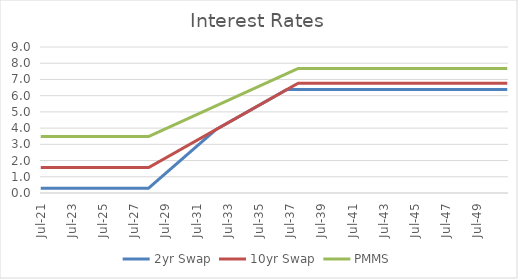
| Category | 2yr Swap | 10yr Swap | PMMS |
|---|---|---|---|
| 2021-07-31 | 0.296 | 1.565 | 3.48 |
| 2021-08-31 | 0.296 | 1.565 | 3.48 |
| 2021-09-30 | 0.296 | 1.565 | 3.48 |
| 2021-10-31 | 0.296 | 1.565 | 3.48 |
| 2021-11-30 | 0.296 | 1.565 | 3.48 |
| 2021-12-31 | 0.296 | 1.565 | 3.48 |
| 2022-01-31 | 0.296 | 1.565 | 3.48 |
| 2022-02-28 | 0.296 | 1.565 | 3.48 |
| 2022-03-31 | 0.296 | 1.565 | 3.48 |
| 2022-04-30 | 0.296 | 1.565 | 3.48 |
| 2022-05-31 | 0.296 | 1.565 | 3.48 |
| 2022-06-30 | 0.296 | 1.565 | 3.48 |
| 2022-07-31 | 0.296 | 1.565 | 3.48 |
| 2022-08-31 | 0.296 | 1.565 | 3.48 |
| 2022-09-30 | 0.296 | 1.565 | 3.48 |
| 2022-10-31 | 0.296 | 1.565 | 3.48 |
| 2022-11-30 | 0.296 | 1.565 | 3.48 |
| 2022-12-31 | 0.296 | 1.565 | 3.48 |
| 2023-01-31 | 0.296 | 1.565 | 3.48 |
| 2023-02-28 | 0.296 | 1.565 | 3.48 |
| 2023-03-31 | 0.296 | 1.565 | 3.48 |
| 2023-04-30 | 0.296 | 1.565 | 3.48 |
| 2023-05-31 | 0.296 | 1.565 | 3.48 |
| 2023-06-30 | 0.296 | 1.565 | 3.48 |
| 2023-07-31 | 0.296 | 1.565 | 3.48 |
| 2023-08-31 | 0.296 | 1.565 | 3.48 |
| 2023-09-30 | 0.296 | 1.565 | 3.48 |
| 2023-10-31 | 0.296 | 1.565 | 3.48 |
| 2023-11-30 | 0.296 | 1.565 | 3.48 |
| 2023-12-31 | 0.296 | 1.565 | 3.48 |
| 2024-01-31 | 0.296 | 1.565 | 3.48 |
| 2024-02-29 | 0.296 | 1.565 | 3.48 |
| 2024-03-31 | 0.296 | 1.565 | 3.48 |
| 2024-04-30 | 0.296 | 1.565 | 3.48 |
| 2024-05-31 | 0.296 | 1.565 | 3.48 |
| 2024-06-30 | 0.296 | 1.565 | 3.48 |
| 2024-07-31 | 0.296 | 1.565 | 3.48 |
| 2024-08-31 | 0.296 | 1.565 | 3.48 |
| 2024-09-30 | 0.296 | 1.565 | 3.48 |
| 2024-10-31 | 0.296 | 1.565 | 3.48 |
| 2024-11-30 | 0.296 | 1.565 | 3.48 |
| 2024-12-31 | 0.296 | 1.565 | 3.48 |
| 2025-01-31 | 0.296 | 1.565 | 3.48 |
| 2025-02-28 | 0.296 | 1.565 | 3.48 |
| 2025-03-31 | 0.296 | 1.565 | 3.48 |
| 2025-04-30 | 0.296 | 1.565 | 3.48 |
| 2025-05-31 | 0.296 | 1.565 | 3.48 |
| 2025-06-30 | 0.296 | 1.565 | 3.48 |
| 2025-07-31 | 0.296 | 1.565 | 3.48 |
| 2025-08-31 | 0.296 | 1.565 | 3.48 |
| 2025-09-30 | 0.296 | 1.565 | 3.48 |
| 2025-10-31 | 0.296 | 1.565 | 3.48 |
| 2025-11-30 | 0.296 | 1.565 | 3.48 |
| 2025-12-31 | 0.296 | 1.565 | 3.48 |
| 2026-01-31 | 0.296 | 1.565 | 3.48 |
| 2026-02-28 | 0.296 | 1.565 | 3.48 |
| 2026-03-31 | 0.296 | 1.565 | 3.48 |
| 2026-04-30 | 0.296 | 1.565 | 3.48 |
| 2026-05-31 | 0.296 | 1.565 | 3.48 |
| 2026-06-30 | 0.296 | 1.565 | 3.48 |
| 2026-07-31 | 0.296 | 1.565 | 3.48 |
| 2026-08-31 | 0.296 | 1.565 | 3.48 |
| 2026-09-30 | 0.296 | 1.565 | 3.48 |
| 2026-10-31 | 0.296 | 1.565 | 3.48 |
| 2026-11-30 | 0.296 | 1.565 | 3.48 |
| 2026-12-31 | 0.296 | 1.565 | 3.48 |
| 2027-01-31 | 0.296 | 1.565 | 3.48 |
| 2027-02-28 | 0.296 | 1.565 | 3.48 |
| 2027-03-31 | 0.296 | 1.565 | 3.48 |
| 2027-04-30 | 0.296 | 1.565 | 3.48 |
| 2027-05-31 | 0.296 | 1.565 | 3.48 |
| 2027-06-30 | 0.296 | 1.565 | 3.48 |
| 2027-07-31 | 0.296 | 1.565 | 3.48 |
| 2027-08-31 | 0.296 | 1.565 | 3.48 |
| 2027-09-30 | 0.296 | 1.565 | 3.48 |
| 2027-10-31 | 0.296 | 1.565 | 3.48 |
| 2027-11-30 | 0.296 | 1.565 | 3.48 |
| 2027-12-31 | 0.296 | 1.565 | 3.48 |
| 2028-01-31 | 0.296 | 1.565 | 3.48 |
| 2028-02-29 | 0.296 | 1.565 | 3.48 |
| 2028-03-31 | 0.296 | 1.565 | 3.48 |
| 2028-04-30 | 0.296 | 1.565 | 3.48 |
| 2028-05-31 | 0.296 | 1.565 | 3.48 |
| 2028-06-30 | 0.296 | 1.565 | 3.48 |
| 2028-07-31 | 0.366 | 1.61 | 3.517 |
| 2028-08-31 | 0.436 | 1.656 | 3.553 |
| 2028-09-30 | 0.505 | 1.701 | 3.59 |
| 2028-10-31 | 0.575 | 1.746 | 3.626 |
| 2028-11-30 | 0.645 | 1.791 | 3.663 |
| 2028-12-31 | 0.714 | 1.836 | 3.699 |
| 2029-01-31 | 0.784 | 1.882 | 3.735 |
| 2029-02-28 | 0.854 | 1.927 | 3.772 |
| 2029-03-31 | 0.923 | 1.972 | 3.808 |
| 2029-04-30 | 0.993 | 2.017 | 3.845 |
| 2029-05-31 | 1.063 | 2.063 | 3.881 |
| 2029-06-30 | 1.132 | 2.108 | 3.918 |
| 2029-07-31 | 1.202 | 2.153 | 3.954 |
| 2029-08-31 | 1.272 | 2.198 | 3.991 |
| 2029-09-30 | 1.341 | 2.243 | 4.027 |
| 2029-10-31 | 1.411 | 2.289 | 4.064 |
| 2029-11-30 | 1.481 | 2.334 | 4.1 |
| 2029-12-31 | 1.55 | 2.379 | 4.137 |
| 2030-01-31 | 1.62 | 2.424 | 4.173 |
| 2030-02-28 | 1.69 | 2.47 | 4.21 |
| 2030-03-31 | 1.759 | 2.515 | 4.246 |
| 2030-04-30 | 1.829 | 2.56 | 4.283 |
| 2030-05-31 | 1.899 | 2.605 | 4.319 |
| 2030-06-30 | 1.968 | 2.65 | 4.356 |
| 2030-07-31 | 2.038 | 2.696 | 4.392 |
| 2030-08-31 | 2.108 | 2.741 | 4.429 |
| 2030-09-30 | 2.177 | 2.786 | 4.465 |
| 2030-10-31 | 2.247 | 2.831 | 4.502 |
| 2030-11-30 | 2.317 | 2.876 | 4.538 |
| 2030-12-31 | 2.386 | 2.922 | 4.575 |
| 2031-01-31 | 2.456 | 2.967 | 4.611 |
| 2031-02-28 | 2.526 | 3.012 | 4.647 |
| 2031-03-31 | 2.595 | 3.057 | 4.684 |
| 2031-04-30 | 2.665 | 3.103 | 4.72 |
| 2031-05-31 | 2.735 | 3.148 | 4.757 |
| 2031-06-30 | 2.804 | 3.193 | 4.793 |
| 2031-07-31 | 2.874 | 3.238 | 4.83 |
| 2031-08-31 | 2.944 | 3.283 | 4.866 |
| 2031-09-30 | 3.013 | 3.329 | 4.903 |
| 2031-10-31 | 3.083 | 3.374 | 4.939 |
| 2031-11-30 | 3.153 | 3.419 | 4.976 |
| 2031-12-31 | 3.222 | 3.464 | 5.012 |
| 2032-01-31 | 3.292 | 3.51 | 5.049 |
| 2032-02-29 | 3.362 | 3.555 | 5.085 |
| 2032-03-31 | 3.431 | 3.6 | 5.122 |
| 2032-04-30 | 3.501 | 3.645 | 5.158 |
| 2032-05-31 | 3.571 | 3.69 | 5.195 |
| 2032-06-30 | 3.64 | 3.736 | 5.231 |
| 2032-07-31 | 3.71 | 3.781 | 5.268 |
| 2032-08-31 | 3.78 | 3.826 | 5.304 |
| 2032-09-30 | 3.849 | 3.871 | 5.341 |
| 2032-10-31 | 3.917 | 3.917 | 5.377 |
| 2032-11-30 | 3.962 | 3.962 | 5.414 |
| 2032-12-31 | 4.007 | 4.007 | 5.45 |
| 2033-01-31 | 4.052 | 4.052 | 5.486 |
| 2033-02-28 | 4.097 | 4.097 | 5.523 |
| 2033-03-31 | 4.143 | 4.143 | 5.559 |
| 2033-04-30 | 4.188 | 4.188 | 5.596 |
| 2033-05-31 | 4.233 | 4.233 | 5.632 |
| 2033-06-30 | 4.278 | 4.278 | 5.669 |
| 2033-07-31 | 4.324 | 4.324 | 5.705 |
| 2033-08-31 | 4.369 | 4.369 | 5.742 |
| 2033-09-30 | 4.414 | 4.414 | 5.778 |
| 2033-10-31 | 4.459 | 4.459 | 5.815 |
| 2033-11-30 | 4.504 | 4.504 | 5.851 |
| 2033-12-31 | 4.55 | 4.55 | 5.888 |
| 2034-01-31 | 4.595 | 4.595 | 5.924 |
| 2034-02-28 | 4.64 | 4.64 | 5.96 |
| 2034-03-31 | 4.685 | 4.685 | 5.997 |
| 2034-04-30 | 4.731 | 4.731 | 6.033 |
| 2034-05-31 | 4.776 | 4.776 | 6.07 |
| 2034-06-30 | 4.821 | 4.821 | 6.106 |
| 2034-07-31 | 4.866 | 4.866 | 6.143 |
| 2034-08-31 | 4.911 | 4.911 | 6.179 |
| 2034-09-30 | 4.957 | 4.957 | 6.216 |
| 2034-10-31 | 5.002 | 5.002 | 6.252 |
| 2034-11-30 | 5.047 | 5.047 | 6.289 |
| 2034-12-31 | 5.092 | 5.092 | 6.325 |
| 2035-01-31 | 5.138 | 5.138 | 6.362 |
| 2035-02-28 | 5.183 | 5.183 | 6.398 |
| 2035-03-31 | 5.228 | 5.228 | 6.434 |
| 2035-04-30 | 5.273 | 5.273 | 6.471 |
| 2035-05-31 | 5.318 | 5.318 | 6.507 |
| 2035-06-30 | 5.364 | 5.364 | 6.544 |
| 2035-07-31 | 5.409 | 5.409 | 6.58 |
| 2035-08-31 | 5.454 | 5.454 | 6.617 |
| 2035-09-30 | 5.499 | 5.499 | 6.653 |
| 2035-10-31 | 5.545 | 5.545 | 6.69 |
| 2035-11-30 | 5.59 | 5.59 | 6.726 |
| 2035-12-31 | 5.635 | 5.635 | 6.763 |
| 2036-01-31 | 5.68 | 5.68 | 6.799 |
| 2036-02-29 | 5.725 | 5.725 | 6.836 |
| 2036-03-31 | 5.771 | 5.771 | 6.872 |
| 2036-04-30 | 5.816 | 5.816 | 6.908 |
| 2036-05-31 | 5.861 | 5.861 | 6.945 |
| 2036-06-30 | 5.906 | 5.906 | 6.981 |
| 2036-07-31 | 5.951 | 5.951 | 7.018 |
| 2036-08-31 | 5.997 | 5.997 | 7.054 |
| 2036-09-30 | 6.042 | 6.042 | 7.091 |
| 2036-10-31 | 6.087 | 6.087 | 7.127 |
| 2036-11-30 | 6.132 | 6.132 | 7.164 |
| 2036-12-31 | 6.178 | 6.178 | 7.2 |
| 2037-01-31 | 6.223 | 6.223 | 7.237 |
| 2037-02-28 | 6.268 | 6.268 | 7.273 |
| 2037-03-31 | 6.313 | 6.313 | 7.31 |
| 2037-04-30 | 6.358 | 6.358 | 7.346 |
| 2037-05-31 | 6.387 | 6.404 | 7.382 |
| 2037-06-30 | 6.387 | 6.449 | 7.419 |
| 2037-07-31 | 6.387 | 6.494 | 7.455 |
| 2037-08-31 | 6.387 | 6.539 | 7.492 |
| 2037-09-30 | 6.387 | 6.585 | 7.528 |
| 2037-10-31 | 6.387 | 6.63 | 7.565 |
| 2037-11-30 | 6.387 | 6.675 | 7.601 |
| 2037-12-31 | 6.387 | 6.72 | 7.637 |
| 2038-01-31 | 6.387 | 6.758 | 7.668 |
| 2038-02-28 | 6.387 | 6.758 | 7.668 |
| 2038-03-31 | 6.387 | 6.758 | 7.668 |
| 2038-04-30 | 6.387 | 6.758 | 7.668 |
| 2038-05-31 | 6.387 | 6.758 | 7.668 |
| 2038-06-30 | 6.387 | 6.758 | 7.668 |
| 2038-07-31 | 6.387 | 6.758 | 7.668 |
| 2038-08-31 | 6.387 | 6.758 | 7.668 |
| 2038-09-30 | 6.387 | 6.758 | 7.668 |
| 2038-10-31 | 6.387 | 6.758 | 7.668 |
| 2038-11-30 | 6.387 | 6.758 | 7.668 |
| 2038-12-31 | 6.387 | 6.758 | 7.668 |
| 2039-01-31 | 6.387 | 6.758 | 7.668 |
| 2039-02-28 | 6.387 | 6.758 | 7.668 |
| 2039-03-31 | 6.387 | 6.758 | 7.668 |
| 2039-04-30 | 6.387 | 6.758 | 7.668 |
| 2039-05-31 | 6.387 | 6.758 | 7.668 |
| 2039-06-30 | 6.387 | 6.758 | 7.668 |
| 2039-07-31 | 6.387 | 6.758 | 7.668 |
| 2039-08-31 | 6.387 | 6.758 | 7.668 |
| 2039-09-30 | 6.387 | 6.758 | 7.668 |
| 2039-10-31 | 6.387 | 6.758 | 7.668 |
| 2039-11-30 | 6.387 | 6.758 | 7.668 |
| 2039-12-31 | 6.387 | 6.758 | 7.668 |
| 2040-01-31 | 6.387 | 6.758 | 7.668 |
| 2040-02-29 | 6.387 | 6.758 | 7.668 |
| 2040-03-31 | 6.387 | 6.758 | 7.668 |
| 2040-04-30 | 6.387 | 6.758 | 7.668 |
| 2040-05-31 | 6.387 | 6.758 | 7.668 |
| 2040-06-30 | 6.387 | 6.758 | 7.668 |
| 2040-07-31 | 6.387 | 6.758 | 7.668 |
| 2040-08-31 | 6.387 | 6.758 | 7.668 |
| 2040-09-30 | 6.387 | 6.758 | 7.668 |
| 2040-10-31 | 6.387 | 6.758 | 7.668 |
| 2040-11-30 | 6.387 | 6.758 | 7.668 |
| 2040-12-31 | 6.387 | 6.758 | 7.668 |
| 2041-01-31 | 6.387 | 6.758 | 7.668 |
| 2041-02-28 | 6.387 | 6.758 | 7.668 |
| 2041-03-31 | 6.387 | 6.758 | 7.668 |
| 2041-04-30 | 6.387 | 6.758 | 7.668 |
| 2041-05-31 | 6.387 | 6.758 | 7.668 |
| 2041-06-30 | 6.387 | 6.758 | 7.668 |
| 2041-07-31 | 6.387 | 6.758 | 7.668 |
| 2041-08-31 | 6.387 | 6.758 | 7.668 |
| 2041-09-30 | 6.387 | 6.758 | 7.668 |
| 2041-10-31 | 6.387 | 6.758 | 7.668 |
| 2041-11-30 | 6.387 | 6.758 | 7.668 |
| 2041-12-31 | 6.387 | 6.758 | 7.668 |
| 2042-01-31 | 6.387 | 6.758 | 7.668 |
| 2042-02-28 | 6.387 | 6.758 | 7.668 |
| 2042-03-31 | 6.387 | 6.758 | 7.668 |
| 2042-04-30 | 6.387 | 6.758 | 7.668 |
| 2042-05-31 | 6.387 | 6.758 | 7.668 |
| 2042-06-30 | 6.387 | 6.758 | 7.668 |
| 2042-07-31 | 6.387 | 6.758 | 7.668 |
| 2042-08-31 | 6.387 | 6.758 | 7.668 |
| 2042-09-30 | 6.387 | 6.758 | 7.668 |
| 2042-10-31 | 6.387 | 6.758 | 7.668 |
| 2042-11-30 | 6.387 | 6.758 | 7.668 |
| 2042-12-31 | 6.387 | 6.758 | 7.668 |
| 2043-01-31 | 6.387 | 6.758 | 7.668 |
| 2043-02-28 | 6.387 | 6.758 | 7.668 |
| 2043-03-31 | 6.387 | 6.758 | 7.668 |
| 2043-04-30 | 6.387 | 6.758 | 7.668 |
| 2043-05-31 | 6.387 | 6.758 | 7.668 |
| 2043-06-30 | 6.387 | 6.758 | 7.668 |
| 2043-07-31 | 6.387 | 6.758 | 7.668 |
| 2043-08-31 | 6.387 | 6.758 | 7.668 |
| 2043-09-30 | 6.387 | 6.758 | 7.668 |
| 2043-10-31 | 6.387 | 6.758 | 7.668 |
| 2043-11-30 | 6.387 | 6.758 | 7.668 |
| 2043-12-31 | 6.387 | 6.758 | 7.668 |
| 2044-01-31 | 6.387 | 6.758 | 7.668 |
| 2044-02-29 | 6.387 | 6.758 | 7.668 |
| 2044-03-31 | 6.387 | 6.758 | 7.668 |
| 2044-04-30 | 6.387 | 6.758 | 7.668 |
| 2044-05-31 | 6.387 | 6.758 | 7.668 |
| 2044-06-30 | 6.387 | 6.758 | 7.668 |
| 2044-07-31 | 6.387 | 6.758 | 7.668 |
| 2044-08-31 | 6.387 | 6.758 | 7.668 |
| 2044-09-30 | 6.387 | 6.758 | 7.668 |
| 2044-10-31 | 6.387 | 6.758 | 7.668 |
| 2044-11-30 | 6.387 | 6.758 | 7.668 |
| 2044-12-31 | 6.387 | 6.758 | 7.668 |
| 2045-01-31 | 6.387 | 6.758 | 7.668 |
| 2045-02-28 | 6.387 | 6.758 | 7.668 |
| 2045-03-31 | 6.387 | 6.758 | 7.668 |
| 2045-04-30 | 6.387 | 6.758 | 7.668 |
| 2045-05-31 | 6.387 | 6.758 | 7.668 |
| 2045-06-30 | 6.387 | 6.758 | 7.668 |
| 2045-07-31 | 6.387 | 6.758 | 7.668 |
| 2045-08-31 | 6.387 | 6.758 | 7.668 |
| 2045-09-30 | 6.387 | 6.758 | 7.668 |
| 2045-10-31 | 6.387 | 6.758 | 7.668 |
| 2045-11-30 | 6.387 | 6.758 | 7.668 |
| 2045-12-31 | 6.387 | 6.758 | 7.668 |
| 2046-01-31 | 6.387 | 6.758 | 7.668 |
| 2046-02-28 | 6.387 | 6.758 | 7.668 |
| 2046-03-31 | 6.387 | 6.758 | 7.668 |
| 2046-04-30 | 6.387 | 6.758 | 7.668 |
| 2046-05-31 | 6.387 | 6.758 | 7.668 |
| 2046-06-30 | 6.387 | 6.758 | 7.668 |
| 2046-07-31 | 6.387 | 6.758 | 7.668 |
| 2046-08-31 | 6.387 | 6.758 | 7.668 |
| 2046-09-30 | 6.387 | 6.758 | 7.668 |
| 2046-10-31 | 6.387 | 6.758 | 7.668 |
| 2046-11-30 | 6.387 | 6.758 | 7.668 |
| 2046-12-31 | 6.387 | 6.758 | 7.668 |
| 2047-01-31 | 6.387 | 6.758 | 7.668 |
| 2047-02-28 | 6.387 | 6.758 | 7.668 |
| 2047-03-31 | 6.387 | 6.758 | 7.668 |
| 2047-04-30 | 6.387 | 6.758 | 7.668 |
| 2047-05-31 | 6.387 | 6.758 | 7.668 |
| 2047-06-30 | 6.387 | 6.758 | 7.668 |
| 2047-07-31 | 6.387 | 6.758 | 7.668 |
| 2047-08-31 | 6.387 | 6.758 | 7.668 |
| 2047-09-30 | 6.387 | 6.758 | 7.668 |
| 2047-10-31 | 6.387 | 6.758 | 7.668 |
| 2047-11-30 | 6.387 | 6.758 | 7.668 |
| 2047-12-31 | 6.387 | 6.758 | 7.668 |
| 2048-01-31 | 6.387 | 6.758 | 7.668 |
| 2048-02-29 | 6.387 | 6.758 | 7.668 |
| 2048-03-31 | 6.387 | 6.758 | 7.668 |
| 2048-04-30 | 6.387 | 6.758 | 7.668 |
| 2048-05-31 | 6.387 | 6.758 | 7.668 |
| 2048-06-30 | 6.387 | 6.758 | 7.668 |
| 2048-07-31 | 6.387 | 6.758 | 7.668 |
| 2048-08-31 | 6.387 | 6.758 | 7.668 |
| 2048-09-30 | 6.387 | 6.758 | 7.668 |
| 2048-10-31 | 6.387 | 6.758 | 7.668 |
| 2048-11-30 | 6.387 | 6.758 | 7.668 |
| 2048-12-31 | 6.387 | 6.758 | 7.668 |
| 2049-01-31 | 6.387 | 6.758 | 7.668 |
| 2049-02-28 | 6.387 | 6.758 | 7.668 |
| 2049-03-31 | 6.387 | 6.758 | 7.668 |
| 2049-04-30 | 6.387 | 6.758 | 7.668 |
| 2049-05-31 | 6.387 | 6.758 | 7.668 |
| 2049-06-30 | 6.387 | 6.758 | 7.668 |
| 2049-07-31 | 6.387 | 6.758 | 7.668 |
| 2049-08-31 | 6.387 | 6.758 | 7.668 |
| 2049-09-30 | 6.387 | 6.758 | 7.668 |
| 2049-10-31 | 6.387 | 6.758 | 7.668 |
| 2049-11-30 | 6.387 | 6.758 | 7.668 |
| 2049-12-31 | 6.387 | 6.758 | 7.668 |
| 2050-01-31 | 6.387 | 6.758 | 7.668 |
| 2050-02-28 | 6.387 | 6.758 | 7.668 |
| 2050-03-31 | 6.387 | 6.758 | 7.668 |
| 2050-04-30 | 6.387 | 6.758 | 7.668 |
| 2050-05-31 | 6.387 | 6.758 | 7.668 |
| 2050-06-30 | 6.387 | 6.758 | 7.668 |
| 2050-07-31 | 6.387 | 6.758 | 7.668 |
| 2050-08-31 | 6.387 | 6.758 | 7.668 |
| 2050-09-30 | 6.387 | 6.758 | 7.668 |
| 2050-10-31 | 6.387 | 6.758 | 7.668 |
| 2050-11-30 | 6.387 | 6.758 | 7.668 |
| 2050-12-31 | 6.387 | 6.758 | 7.668 |
| 2051-01-31 | 6.387 | 6.758 | 7.668 |
| 2051-02-28 | 6.387 | 6.758 | 7.668 |
| 2051-03-31 | 6.387 | 6.758 | 7.668 |
| 2051-04-30 | 6.387 | 6.758 | 7.668 |
| 2051-05-31 | 6.387 | 6.758 | 7.668 |
| 2051-06-30 | 6.387 | 6.758 | 7.668 |